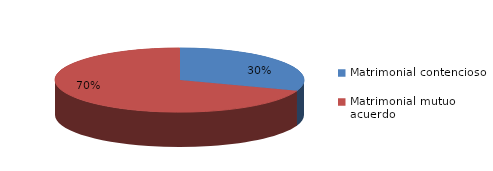
| Category | Series 0 |
|---|---|
| 0 | 509 |
| 1 | 1163 |